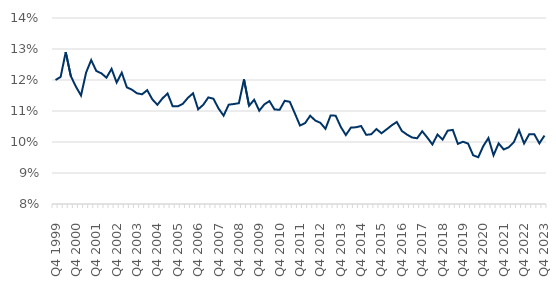
| Category | Series 0 |
|---|---|
| Q4 1999 | 12 |
| Q1 2000 | 12.1 |
| Q2 2000 | 12.9 |
| Q3 2000 | 12.125 |
| Q4 2000 | 11.786 |
| Q1 2001 | 11.5 |
| Q2 2001 | 12.242 |
| Q3 2001 | 12.643 |
| Q4 2001 | 12.292 |
| Q1 2002 | 12.215 |
| Q2 2002 | 12.075 |
| Q3 2002 | 12.36 |
| Q4 2002 | 11.918 |
| Q1 2003 | 12.237 |
| Q2 2003 | 11.762 |
| Q3 2003 | 11.688 |
| Q4 2003 | 11.57 |
| Q1 2004 | 11.54 |
| Q2 2004 | 11.671 |
| Q3 2004 | 11.376 |
| Q4 2004 | 11.2 |
| Q1 2005 | 11.408 |
| Q2 2005 | 11.565 |
| Q3 2005 | 11.15 |
| Q4 2005 | 11.15 |
| Q1 2006 | 11.233 |
| Q2 2006 | 11.427 |
| Q3 2006 | 11.571 |
| Q4 2006 | 11.055 |
| Q1 2007 | 11.2 |
| Q2 2007 | 11.438 |
| Q3 2007 | 11.396 |
| Q4 2007 | 11.082 |
| Q1 2008 | 10.85 |
| Q2 2008 | 11.204 |
| Q3 2008 | 11.225 |
| Q4 2008 | 11.252 |
| Q1 2009 | 12.02 |
| Q2 2009 | 11.168 |
| Q3 2009 | 11.362 |
| Q4 2009 | 11.01 |
| Q1 2010 | 11.215 |
| Q2 2010 | 11.32 |
| Q3 2010 | 11.05 |
| Q4 2010 | 11.038 |
| Q1 2011 | 11.33 |
| Q2 2011 | 11.296 |
| Q3 2011 | 10.919 |
| Q4 2011 | 10.531 |
| Q1 2012 | 10.609 |
| Q2 2012 | 10.848 |
| Q3 2012 | 10.692 |
| Q4 2012 | 10.619 |
| Q1 2013 | 10.425 |
| Q2 2013 | 10.853 |
| Q3 2013 | 10.85 |
| Q4 2013 | 10.489 |
| Q1 2014 | 10.224 |
| Q2 2014 | 10.464 |
| Q3 2014 | 10.475 |
| Q4 2014 | 10.515 |
| Q1 2015 | 10.231 |
| Q2 2015 | 10.25 |
| Q3 2015 | 10.418 |
| Q4 2015 | 10.282 |
| Q1 2016 | 10.406 |
| Q2 2016 | 10.537 |
| Q3 2016 | 10.647 |
| Q4 2016 | 10.356 |
| Q1 2017 | 10.24 |
| Q2 2017 | 10.146 |
| Q3 2017 | 10.121 |
| Q4 2017 | 10.348 |
| Q1 2018 | 10.142 |
| Q2 2018 | 9.921 |
| Q3 2018 | 10.244 |
| Q4 2018 | 10.077 |
| Q1 2019 | 10.367 |
| Q2 2019 | 10.39 |
| Q3 2019 | 9.94 |
| Q4 2019 | 10.008 |
| Q1 2020 | 9.95 |
| Q2 2020 | 9.573 |
| Q3 2020 | 9.508 |
| Q4 2020 | 9.872 |
| Q1 2021 | 10.128 |
| Q2 2021 | 9.572 |
| Q3 2021 | 9.956 |
| Q4 2021 | 9.759 |
| Q1 2022 | 9.831 |
| Q2 2022 | 9.997 |
| Q3 2022 | 10.384 |
| Q4 2022 | 9.953 |
| Q1 2023 | 10.248 |
| Q2 2023 | 10.252 |
| Q3 2023 | 9.956 |
| Q4 2023 | 10.207 |